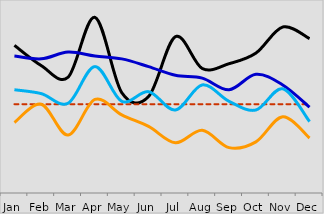
| Category | Org1 | Target / Benchmark / Std. | Org2 | Org3 | Org4 |
|---|---|---|---|---|---|
| Jan | 153 | 92 | 142 | 107 | 73 |
| Feb | 132 | 92 | 139 | 103 | 92 |
| Mar | 120 | 92 | 146 | 93 | 60 |
| Apr | 182 | 92 | 142 | 131 | 97 |
| May | 104 | 92 | 139 | 95 | 81 |
| Jun | 100 | 92 | 131 | 105 | 69 |
| Jul | 162 | 92 | 122 | 86 | 52 |
| Aug | 129 | 92 | 119 | 112 | 65 |
| Sep | 134 | 92 | 107 | 95 | 47 |
| Oct | 145 | 92 | 123 | 86 | 53 |
| Nov | 172 | 92 | 112 | 108 | 79 |
| Dec | 160 | 92 | 89 | 74 | 57 |